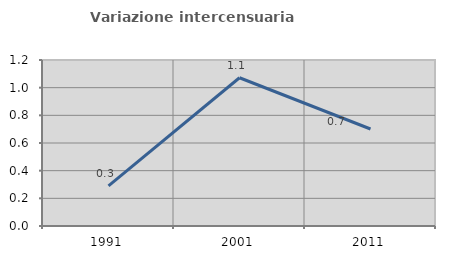
| Category | Variazione intercensuaria annua |
|---|---|
| 1991.0 | 0.29 |
| 2001.0 | 1.072 |
| 2011.0 | 0.701 |